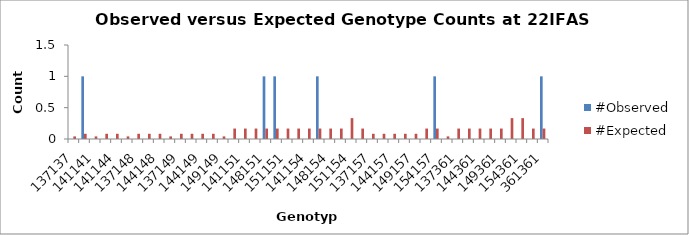
| Category | #Observed | #Expected |
|---|---|---|
| 137137.0 | 0 | 0.042 |
| 137141.0 | 1 | 0.083 |
| 141141.0 | 0 | 0.042 |
| 137144.0 | 0 | 0.083 |
| 141144.0 | 0 | 0.083 |
| 144144.0 | 0 | 0.042 |
| 137148.0 | 0 | 0.083 |
| 141148.0 | 0 | 0.083 |
| 144148.0 | 0 | 0.083 |
| 148148.0 | 0 | 0.042 |
| 137149.0 | 0 | 0.083 |
| 141149.0 | 0 | 0.083 |
| 144149.0 | 0 | 0.083 |
| 148149.0 | 0 | 0.083 |
| 149149.0 | 0 | 0.042 |
| 137151.0 | 0 | 0.167 |
| 141151.0 | 0 | 0.167 |
| 144151.0 | 0 | 0.167 |
| 148151.0 | 1 | 0.167 |
| 149151.0 | 1 | 0.167 |
| 151151.0 | 0 | 0.167 |
| 137154.0 | 0 | 0.167 |
| 141154.0 | 0 | 0.167 |
| 144154.0 | 1 | 0.167 |
| 148154.0 | 0 | 0.167 |
| 149154.0 | 0 | 0.167 |
| 151154.0 | 0 | 0.333 |
| 154154.0 | 0 | 0.167 |
| 137157.0 | 0 | 0.083 |
| 141157.0 | 0 | 0.083 |
| 144157.0 | 0 | 0.083 |
| 148157.0 | 0 | 0.083 |
| 149157.0 | 0 | 0.083 |
| 151157.0 | 0 | 0.167 |
| 154157.0 | 1 | 0.167 |
| 157157.0 | 0 | 0.042 |
| 137361.0 | 0 | 0.167 |
| 141361.0 | 0 | 0.167 |
| 144361.0 | 0 | 0.167 |
| 148361.0 | 0 | 0.167 |
| 149361.0 | 0 | 0.167 |
| 151361.0 | 0 | 0.333 |
| 154361.0 | 0 | 0.333 |
| 157361.0 | 0 | 0.167 |
| 361361.0 | 1 | 0.167 |